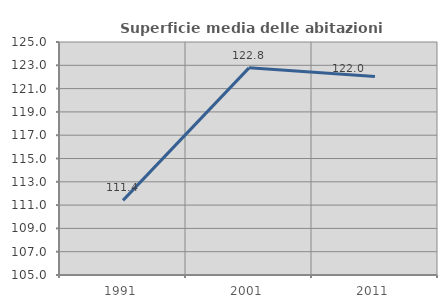
| Category | Superficie media delle abitazioni occupate |
|---|---|
| 1991.0 | 111.404 |
| 2001.0 | 122.782 |
| 2011.0 | 122.04 |